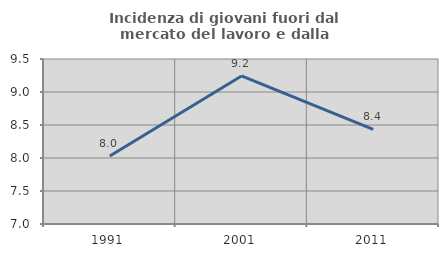
| Category | Incidenza di giovani fuori dal mercato del lavoro e dalla formazione  |
|---|---|
| 1991.0 | 8.029 |
| 2001.0 | 9.244 |
| 2011.0 | 8.434 |